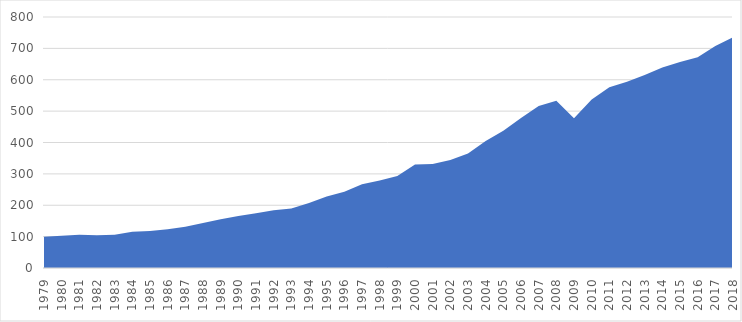
| Category | Series 0 |
|---|---|
| 1979.0 | 100 |
| 1980.0 | 102.968 |
| 1981.0 | 106.161 |
| 1982.0 | 104.473 |
| 1983.0 | 106.11 |
| 1984.0 | 115.273 |
| 1985.0 | 118.3 |
| 1986.0 | 123.504 |
| 1987.0 | 131.611 |
| 1988.0 | 143.363 |
| 1989.0 | 155.141 |
| 1990.0 | 165.765 |
| 1991.0 | 174.378 |
| 1992.0 | 184.215 |
| 1993.0 | 189.647 |
| 1994.0 | 207.523 |
| 1995.0 | 227.543 |
| 1996.0 | 242.702 |
| 1997.0 | 266.853 |
| 1998.0 | 279.07 |
| 1999.0 | 293.609 |
| 2000.0 | 329.879 |
| 2001.0 | 331.726 |
| 2002.0 | 344.295 |
| 2003.0 | 364.681 |
| 2004.0 | 405.113 |
| 2005.0 | 437.32 |
| 2006.0 | 478.323 |
| 2007.0 | 516.727 |
| 2008.0 | 532.875 |
| 2009.0 | 477.168 |
| 2010.0 | 537.043 |
| 2011.0 | 576.043 |
| 2012.0 | 593.682 |
| 2013.0 | 615.197 |
| 2014.0 | 638.944 |
| 2015.0 | 656.911 |
| 2016.0 | 671.685 |
| 2017.0 | 707.949 |
| 2018.0 | 735.084 |